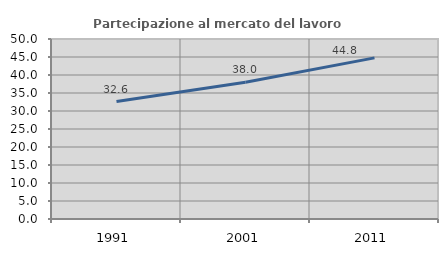
| Category | Partecipazione al mercato del lavoro  femminile |
|---|---|
| 1991.0 | 32.622 |
| 2001.0 | 37.994 |
| 2011.0 | 44.753 |